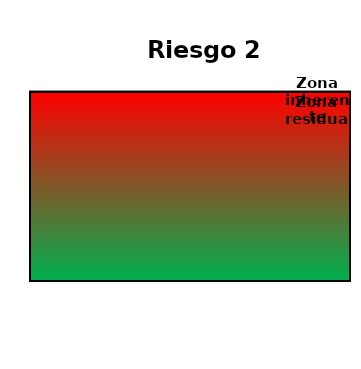
| Category | Zona  | Zona Residual | Zona inherente |
|---|---|---|---|
| Riesgo 2 | 4 | 4 | 4 |